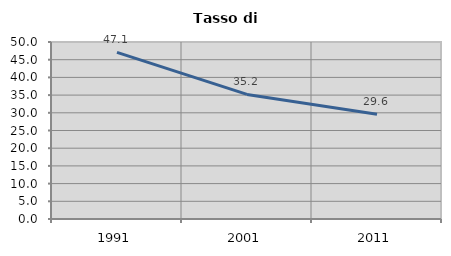
| Category | Tasso di disoccupazione   |
|---|---|
| 1991.0 | 47.083 |
| 2001.0 | 35.191 |
| 2011.0 | 29.609 |